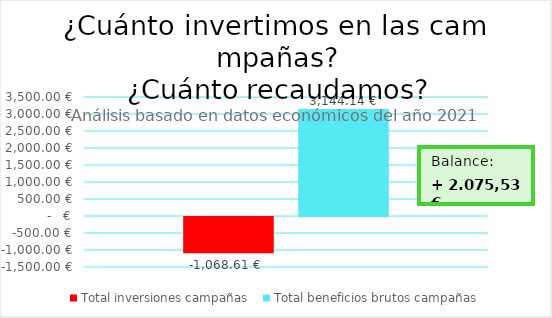
| Category | Total inversiones campañas  | Total beneficios brutos campañas |
|---|---|---|
| 0 | -1068.61 | 3144.14 |